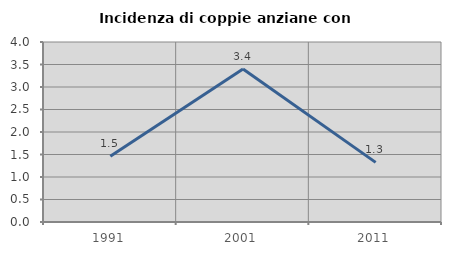
| Category | Incidenza di coppie anziane con figli |
|---|---|
| 1991.0 | 1.46 |
| 2001.0 | 3.401 |
| 2011.0 | 1.325 |